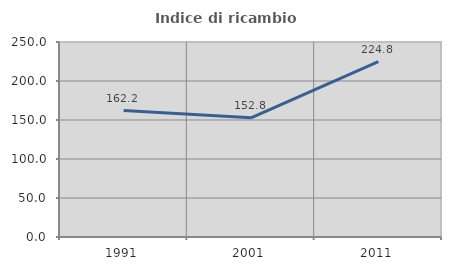
| Category | Indice di ricambio occupazionale  |
|---|---|
| 1991.0 | 162.162 |
| 2001.0 | 152.846 |
| 2011.0 | 224.823 |